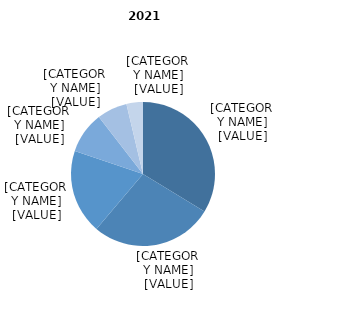
| Category | Series 0 |
|---|---|
| 60-64 ani | 0.337 |
| 65-69 ani | 0.275 |
| 70-74 ani | 0.19 |
| 75-79 ani | 0.093 |
| 80-84 ani | 0.068 |
| 85 ani şi peste | 0.037 |